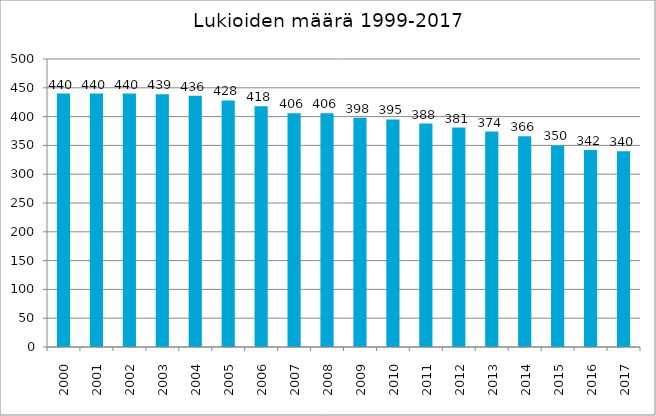
| Category | Lukioiden määrä |
|---|---|
| 2000.0 | 440 |
| 2001.0 | 440 |
| 2002.0 | 440 |
| 2003.0 | 439 |
| 2004.0 | 436 |
| 2005.0 | 428 |
| 2006.0 | 418 |
| 2007.0 | 406 |
| 2008.0 | 406 |
| 2009.0 | 398 |
| 2010.0 | 395 |
| 2011.0 | 388 |
| 2012.0 | 381 |
| 2013.0 | 374 |
| 2014.0 | 366 |
| 2015.0 | 350 |
| 2016.0 | 342 |
| 2017.0 | 340 |